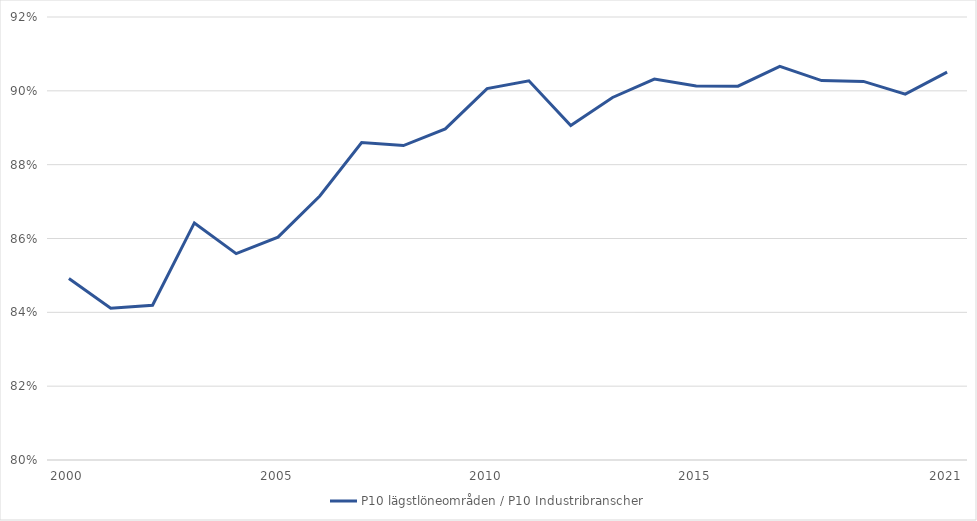
| Category | P10 lägstlöneområden / P10 Industribranscher |
|---|---|
| 2000.0 | 0.849 |
| nan | 0.841 |
| nan | 0.842 |
| nan | 0.864 |
| nan | 0.856 |
| 2005.0 | 0.86 |
| nan | 0.872 |
| nan | 0.886 |
| nan | 0.885 |
| nan | 0.89 |
| 2010.0 | 0.901 |
| nan | 0.903 |
| nan | 0.891 |
| nan | 0.898 |
| nan | 0.903 |
| 2015.0 | 0.901 |
| nan | 0.901 |
| nan | 0.907 |
| nan | 0.903 |
| nan | 0.903 |
| nan | 0.899 |
| 2021.0 | 0.905 |